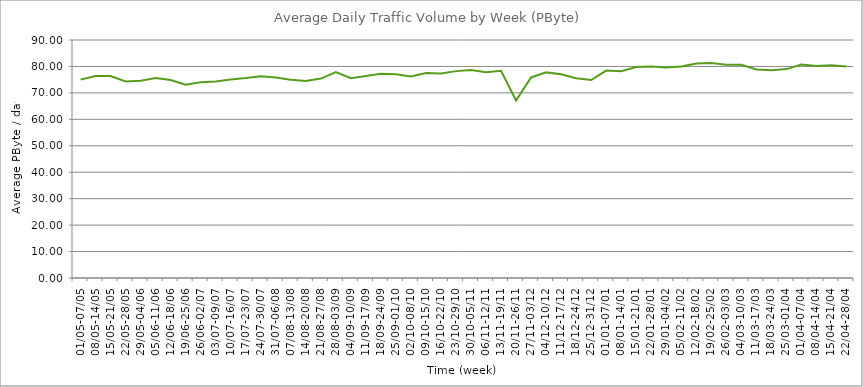
| Category | Average |
|---|---|
| 01/05-07/05 | 75.01 |
| 08/05-14/05 | 76.37 |
| 15/05-21/05 | 76.4 |
| 22/05-28/05 | 74.31 |
| 29/05-04/06 | 74.62 |
| 05/06-11/06 | 75.64 |
| 12/06-18/06 | 74.88 |
| 19/06-25/06 | 73.1 |
| 26/06-02/07 | 74.01 |
| 03/07-09/07 | 74.3 |
| 10/07-16/07 | 75.1 |
| 17/07-23/07 | 75.61 |
| 24/07-30/07 | 76.32 |
| 31/07-06/08 | 75.83 |
| 07/08-13/08 | 74.96 |
| 14/08-20/08 | 74.52 |
| 21/08-27/08 | 75.42 |
| 28/08-03/09 | 77.83 |
| 04/09-10/09 | 75.55 |
| 11/09-17/09 | 76.4 |
| 18/09-24/09 | 77.2 |
| 25/09-01/10 | 77.08 |
| 02/10-08/10 | 76.22 |
| 09/10-15/10 | 77.54 |
| 16/10-22/10 | 77.29 |
| 23/10-29/10 | 78.23 |
| 30/10-05/11 | 78.61 |
| 06/11-12/11 | 77.77 |
| 13/11-19/11 | 78.33 |
| 20/11-26/11 | 67.14 |
| 27/11-03/12 | 75.84 |
| 04/12-10/12 | 77.75 |
| 11/12-17/12 | 77.03 |
| 18/12-24/12 | 75.54 |
| 25/12-31/12 | 74.87 |
| 01/01-07/01 | 78.44 |
| 08/01-14/01 | 78.18 |
| 15/01-21/01 | 79.77 |
| 22/01-28/01 | 79.97 |
| 29/01-04/02 | 79.63 |
| 05/02-11/02 | 79.96 |
| 12/02-18/02 | 81.14 |
| 19/02-25/02 | 81.32 |
| 26/02-03/03 | 80.64 |
| 04/03-10/03 | 80.62 |
| 11/03-17/03 | 78.85 |
| 18/03-24/03 | 78.58 |
| 25/03-01/04 | 78.99 |
| 01/04-07/04 | 80.72 |
| 08/04-14/04 | 80.2 |
| 15/04-21/04 | 80.47 |
| 22/04-28/04 | 79.95 |